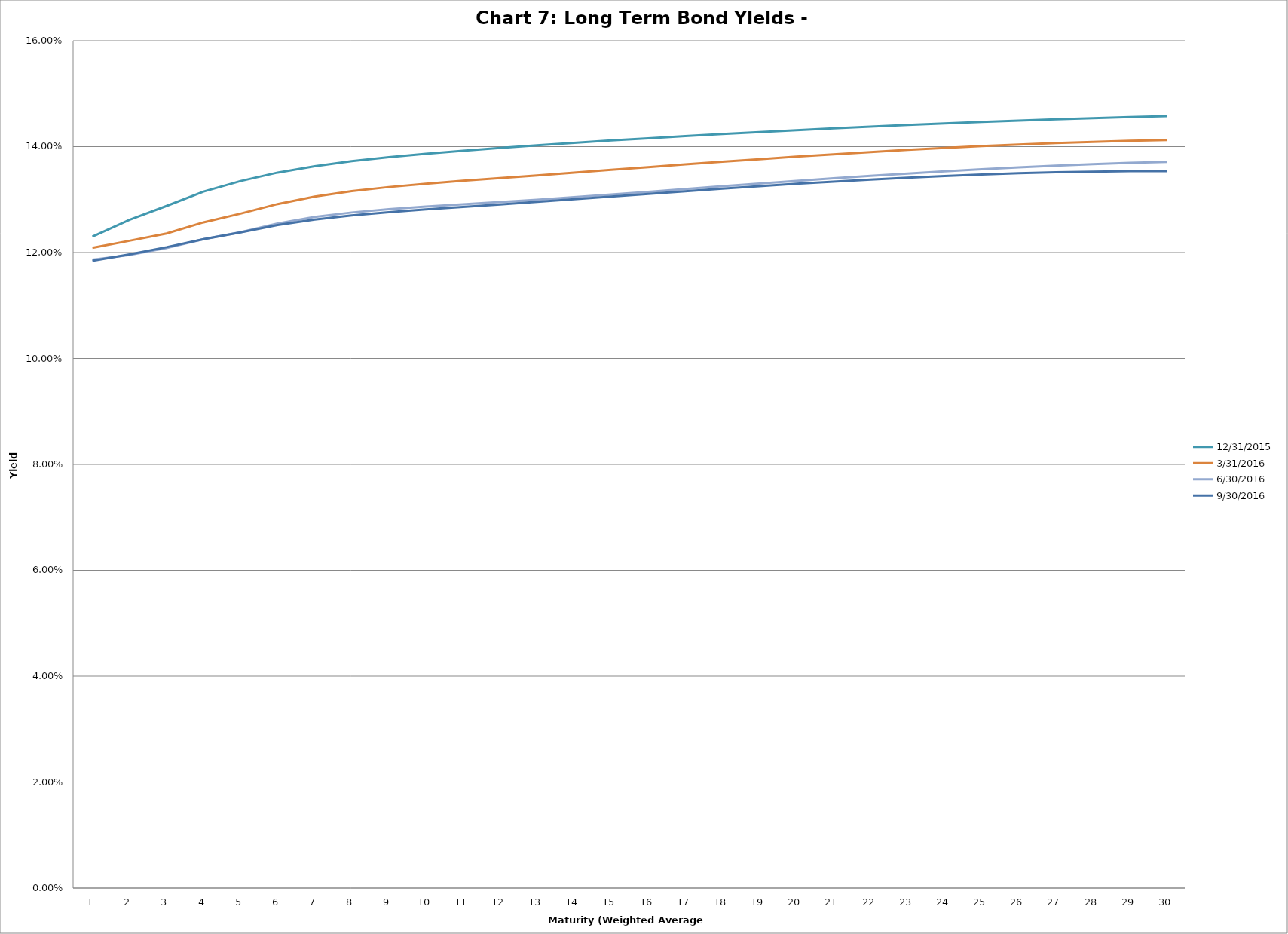
| Category | 12/31/2015 | 3/31/2016 | 6/30/2016 | 9/30/2016 |
|---|---|---|---|---|
| 0 | 0.123 | 0.121 | 0.119 | 0.118 |
| 1 | 0.126 | 0.122 | 0.12 | 0.12 |
| 2 | 0.129 | 0.124 | 0.121 | 0.121 |
| 3 | 0.132 | 0.126 | 0.123 | 0.123 |
| 4 | 0.134 | 0.127 | 0.124 | 0.124 |
| 5 | 0.135 | 0.129 | 0.125 | 0.125 |
| 6 | 0.136 | 0.131 | 0.127 | 0.126 |
| 7 | 0.137 | 0.132 | 0.128 | 0.127 |
| 8 | 0.138 | 0.132 | 0.128 | 0.128 |
| 9 | 0.139 | 0.133 | 0.129 | 0.128 |
| 10 | 0.139 | 0.134 | 0.129 | 0.129 |
| 11 | 0.14 | 0.134 | 0.13 | 0.129 |
| 12 | 0.14 | 0.135 | 0.13 | 0.13 |
| 13 | 0.141 | 0.135 | 0.13 | 0.13 |
| 14 | 0.141 | 0.136 | 0.131 | 0.131 |
| 15 | 0.142 | 0.136 | 0.131 | 0.131 |
| 16 | 0.142 | 0.137 | 0.132 | 0.132 |
| 17 | 0.142 | 0.137 | 0.133 | 0.132 |
| 18 | 0.143 | 0.138 | 0.133 | 0.133 |
| 19 | 0.143 | 0.138 | 0.134 | 0.133 |
| 20 | 0.143 | 0.139 | 0.134 | 0.133 |
| 21 | 0.144 | 0.139 | 0.134 | 0.134 |
| 22 | 0.144 | 0.139 | 0.135 | 0.134 |
| 23 | 0.144 | 0.14 | 0.135 | 0.134 |
| 24 | 0.145 | 0.14 | 0.136 | 0.135 |
| 25 | 0.145 | 0.14 | 0.136 | 0.135 |
| 26 | 0.145 | 0.141 | 0.136 | 0.135 |
| 27 | 0.145 | 0.141 | 0.137 | 0.135 |
| 28 | 0.146 | 0.141 | 0.137 | 0.135 |
| 29 | 0.146 | 0.141 | 0.137 | 0.135 |